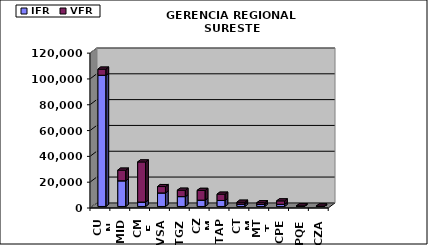
| Category | IFR | VFR |
|---|---|---|
| CUN | 101682 | 4760 |
| MID | 19899 | 8250 |
| CME | 3413 | 31097 |
| VSA | 10484 | 4952 |
| TGZ | 7652 | 4955 |
| CZM | 4892 | 7609 |
| TAP | 4650 | 4889 |
| CTM | 1871 | 1446 |
| MTT | 1539 | 1348 |
| CPE | 1667 | 2666 |
| PQE | 164 | 301 |
| CZA | 17 | 329 |